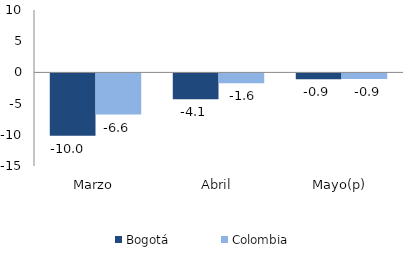
| Category | Bogotá | Colombia |
|---|---|---|
| Marzo | -9.985 | -6.596 |
| Abril | -4.142 | -1.559 |
| Mayo(p) | -0.943 | -0.882 |